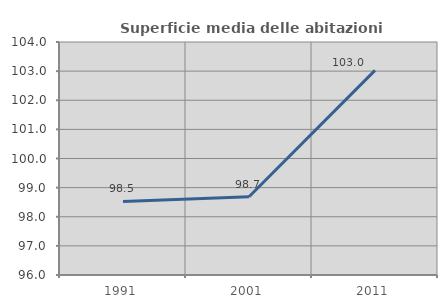
| Category | Superficie media delle abitazioni occupate |
|---|---|
| 1991.0 | 98.525 |
| 2001.0 | 98.687 |
| 2011.0 | 103.024 |